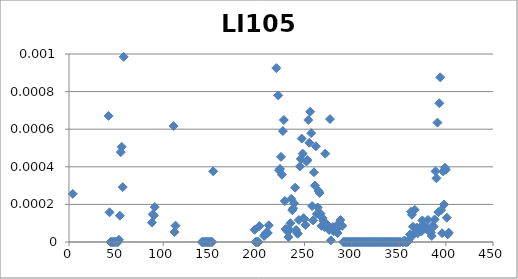
| Category |  LI105  |
|---|---|
| 0 | 0.053 |
| 1 | 0.042 |
| 2 | 0.025 |
| 3 | 0 |
| 4 | 0.047 |
| 5 | 0.03 |
| 6 | 0.042 |
| 7 | 0.062 |
| 8 | 0.048 |
| 9 | 0.045 |
| 10 | 0.051 |
| 11 | 0.072 |
| 12 | 0.045 |
| 13 | 0.026 |
| 14 | 0.02 |
| 15 | 0.01 |
| 16 | 0.005 |
| 17 | 0.013 |
| 18 | 0.018 |
| 19 | 0.017 |
| 20 | 0.024 |
| 21 | 0.021 |
| 22 | 0.016 |
| 23 | 0.015 |
| 24 | 0.014 |
| 25 | 0.012 |
| 26 | 0.017 |
| 27 | 0.008 |
| 28 | 0.008 |
| 29 | 0.007 |
| 30 | 0.006 |
| 31 | 0.009 |
| 32 | 0.008 |
| 33 | 0.011 |
| 34 | 0.006 |
| 35 | 0.006 |
| 36 | 0.005 |
| 37 | 0.007 |
| 38 | 0.01 |
| 39 | 0.014 |
| 40 | 0.007 |
| 41 | 0.001 |
| 42 | 0 |
| 43 | 0 |
| 44 | 0 |
| 45 | 0 |
| 46 | 0 |
| 47 | 0 |
| 48 | 0 |
| 49 | 0 |
| 50 | 0 |
| 51 | 0 |
| 52 | 0 |
| 53 | 0 |
| 54 | 0 |
| 55 | 0.001 |
| 56 | 0 |
| 57 | 0.001 |
| 58 | 0.006 |
| 59 | 0.005 |
| 60 | 0.004 |
| 61 | 0.008 |
| 62 | 0.014 |
| 63 | 0.009 |
| 64 | 0.009 |
| 65 | 0.014 |
| 66 | 0.017 |
| 67 | 0.019 |
| 68 | 0.017 |
| 69 | 0.018 |
| 70 | 0.019 |
| 71 | 0.007 |
| 72 | 0.002 |
| 73 | 0.006 |
| 74 | 0.017 |
| 75 | 0.021 |
| 76 | 0.02 |
| 77 | 0.005 |
| 78 | 0.002 |
| 79 | 0.013 |
| 80 | 0.015 |
| 81 | 0.012 |
| 82 | 0.017 |
| 83 | 0.019 |
| 84 | 0.018 |
| 85 | 0.017 |
| 86 | 0.002 |
| 87 | 0 |
| 88 | 0 |
| 89 | 0 |
| 90 | 0 |
| 91 | 0.001 |
| 92 | 0.006 |
| 93 | 0.01 |
| 94 | 0.011 |
| 95 | 0.013 |
| 96 | 0.01 |
| 97 | 0.008 |
| 98 | 0.009 |
| 99 | 0.009 |
| 100 | 0.009 |
| 101 | 0.01 |
| 102 | 0.011 |
| 103 | 0.009 |
| 104 | 0.003 |
| 105 | 0.009 |
| 106 | 0.007 |
| 107 | 0.01 |
| 108 | 0.009 |
| 109 | 0.011 |
| 110 | 0.001 |
| 111 | 0 |
| 112 | 0 |
| 113 | 0.005 |
| 114 | 0.012 |
| 115 | 0.008 |
| 116 | 0.009 |
| 117 | 0.012 |
| 118 | 0.012 |
| 119 | 0.012 |
| 120 | 0.011 |
| 121 | 0.014 |
| 122 | 0.012 |
| 123 | 0.011 |
| 124 | 0.009 |
| 125 | 0.008 |
| 126 | 0.014 |
| 127 | 0.011 |
| 128 | 0.008 |
| 129 | 0.007 |
| 130 | 0.009 |
| 131 | 0.01 |
| 132 | 0.009 |
| 133 | 0.009 |
| 134 | 0.009 |
| 135 | 0.009 |
| 136 | 0.007 |
| 137 | 0.009 |
| 138 | 0.005 |
| 139 | 0.003 |
| 140 | 0 |
| 141 | 0 |
| 142 | 0 |
| 143 | 0 |
| 144 | 0 |
| 145 | 0 |
| 146 | 0 |
| 147 | 0 |
| 148 | 0 |
| 149 | 0 |
| 150 | 0 |
| 151 | 0 |
| 152 | 0 |
| 153 | 0.011 |
| 154 | 0.009 |
| 155 | 0.012 |
| 156 | 0.019 |
| 157 | 0.017 |
| 158 | 0.017 |
| 159 | 0.014 |
| 160 | 0.012 |
| 161 | 0.016 |
| 162 | 0.011 |
| 163 | 0.017 |
| 164 | 0.017 |
| 165 | 0.011 |
| 166 | 0.013 |
| 167 | 0.027 |
| 168 | 0.027 |
| 169 | 0.022 |
| 170 | 0.016 |
| 171 | 0.013 |
| 172 | 0.009 |
| 173 | 0.019 |
| 174 | 0.015 |
| 175 | 0.019 |
| 176 | 0.016 |
| 177 | 0.018 |
| 178 | 0.013 |
| 179 | 0.012 |
| 180 | 0.011 |
| 181 | 0.014 |
| 182 | 0.012 |
| 183 | 0.01 |
| 184 | 0.013 |
| 185 | 0.014 |
| 186 | 0.009 |
| 187 | 0.011 |
| 188 | 0.009 |
| 189 | 0.01 |
| 190 | 0.01 |
| 191 | 0.009 |
| 192 | 0.008 |
| 193 | 0.009 |
| 194 | 0.01 |
| 195 | 0.002 |
| 196 | 0 |
| 197 | 0 |
| 198 | 0 |
| 199 | 0 |
| 200 | 0 |
| 201 | 0 |
| 202 | 0.008 |
| 203 | 0.008 |
| 204 | 0.008 |
| 205 | 0.007 |
| 206 | 0 |
| 207 | 0 |
| 208 | 0 |
| 209 | 0 |
| 210 | 0 |
| 211 | 0 |
| 212 | 0.009 |
| 213 | 0.009 |
| 214 | 0.013 |
| 215 | 0.012 |
| 216 | 0.01 |
| 217 | 0.01 |
| 218 | 0.008 |
| 219 | 0.001 |
| 220 | 0.003 |
| 221 | 0.001 |
| 222 | 0 |
| 223 | 0 |
| 224 | 0 |
| 225 | 0 |
| 226 | 0.001 |
| 227 | 0.001 |
| 228 | 0 |
| 229 | 0 |
| 230 | 0 |
| 231 | 0 |
| 232 | 0 |
| 233 | 0 |
| 234 | 0 |
| 235 | 0 |
| 236 | 0 |
| 237 | 0 |
| 238 | 0 |
| 239 | 0 |
| 240 | 0 |
| 241 | 0 |
| 242 | 0 |
| 243 | 0 |
| 244 | 0 |
| 245 | 0 |
| 246 | 0.001 |
| 247 | 0 |
| 248 | 0 |
| 249 | 0 |
| 250 | 0 |
| 251 | 0 |
| 252 | 0 |
| 253 | 0.001 |
| 254 | 0.001 |
| 255 | 0.001 |
| 256 | 0.001 |
| 257 | 0 |
| 258 | 0 |
| 259 | 0 |
| 260 | 0 |
| 261 | 0.001 |
| 262 | 0 |
| 263 | 0 |
| 264 | 0 |
| 265 | 0 |
| 266 | 0 |
| 267 | 0 |
| 268 | 0 |
| 269 | 0 |
| 270 | 0 |
| 271 | 0 |
| 272 | 0 |
| 273 | 0 |
| 274 | 0 |
| 275 | 0 |
| 276 | 0.001 |
| 277 | 0 |
| 278 | 0 |
| 279 | 0 |
| 280 | 0 |
| 281 | 0 |
| 282 | 0 |
| 283 | 0 |
| 284 | 0 |
| 285 | 0 |
| 286 | 0 |
| 287 | 0 |
| 288 | 0 |
| 289 | 0 |
| 290 | 0 |
| 291 | 0 |
| 292 | 0 |
| 293 | 0 |
| 294 | 0 |
| 295 | 0 |
| 296 | 0 |
| 297 | 0 |
| 298 | 0 |
| 299 | 0 |
| 300 | 0 |
| 301 | 0 |
| 302 | 0 |
| 303 | 0 |
| 304 | 0 |
| 305 | 0 |
| 306 | 0 |
| 307 | 0 |
| 308 | 0 |
| 309 | 0 |
| 310 | 0 |
| 311 | 0 |
| 312 | 0 |
| 313 | 0 |
| 314 | 0 |
| 315 | 0 |
| 316 | 0 |
| 317 | 0 |
| 318 | 0 |
| 319 | 0 |
| 320 | 0 |
| 321 | 0 |
| 322 | 0 |
| 323 | 0 |
| 324 | 0 |
| 325 | 0 |
| 326 | 0 |
| 327 | 0 |
| 328 | 0 |
| 329 | 0 |
| 330 | 0 |
| 331 | 0 |
| 332 | 0 |
| 333 | 0 |
| 334 | 0 |
| 335 | 0 |
| 336 | 0 |
| 337 | 0 |
| 338 | 0 |
| 339 | 0 |
| 340 | 0 |
| 341 | 0 |
| 342 | 0 |
| 343 | 0 |
| 344 | 0 |
| 345 | 0 |
| 346 | 0 |
| 347 | 0 |
| 348 | 0 |
| 349 | 0 |
| 350 | 0 |
| 351 | 0 |
| 352 | 0.002 |
| 353 | 0 |
| 354 | 0 |
| 355 | 0 |
| 356 | 0 |
| 357 | 0 |
| 358 | 0 |
| 359 | 0 |
| 360 | 0 |
| 361 | 0 |
| 362 | 0 |
| 363 | 0 |
| 364 | 0 |
| 365 | 0 |
| 366 | 0 |
| 367 | 0 |
| 368 | 0 |
| 369 | 0 |
| 370 | 0 |
| 371 | 0 |
| 372 | 0 |
| 373 | 0 |
| 374 | 0 |
| 375 | 0 |
| 376 | 0 |
| 377 | 0 |
| 378 | 0 |
| 379 | 0 |
| 380 | 0 |
| 381 | 0 |
| 382 | 0 |
| 383 | 0 |
| 384 | 0 |
| 385 | 0 |
| 386 | 0 |
| 387 | 0 |
| 388 | 0 |
| 389 | 0 |
| 390 | 0.001 |
| 391 | 0 |
| 392 | 0.001 |
| 393 | 0.001 |
| 394 | 0 |
| 395 | 0 |
| 396 | 0 |
| 397 | 0 |
| 398 | 0 |
| 399 | 0 |
| 400 | 0 |
| 401 | 0 |
| 402 | 0 |